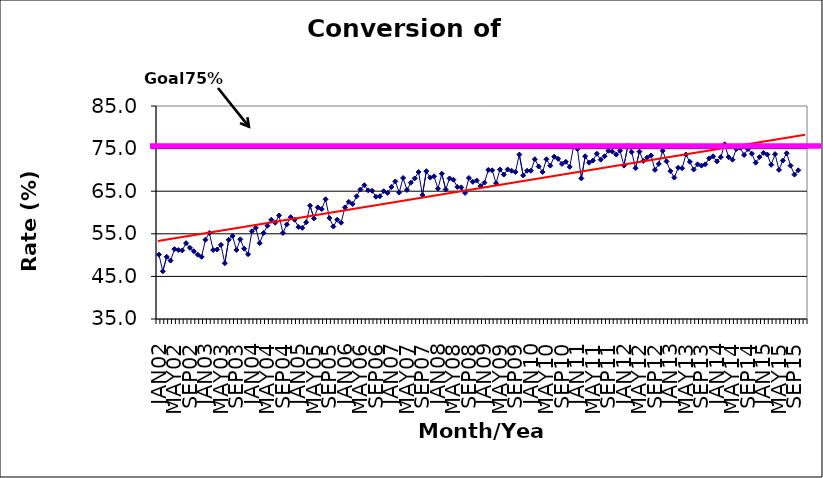
| Category | Series 0 |
|---|---|
| JAN02 | 50.1 |
| FEB02 | 46.2 |
| MAR02 | 49.6 |
| APR02 | 48.7 |
| MAY02 | 51.4 |
| JUN02 | 51.2 |
| JUL02 | 51.1 |
| AUG02 | 52.8 |
| SEP02 | 51.7 |
| OCT02 | 50.9 |
| NOV02 | 50.1 |
| DEC02 | 49.6 |
| JAN03 | 53.6 |
| FEB03 | 55.2 |
| MAR03 | 51.2 |
| APR03 | 51.3 |
| MAY03 | 52.4 |
| JUN03 | 48.1 |
| JUL03 | 53.6 |
| AUG03 | 54.5 |
| SEP03 | 51.2 |
| OCT03 | 53.7 |
| NOV03 | 51.5 |
| DEC03 | 50.2 |
| JAN04 | 55.6 |
| FEB04 | 56.4 |
| MAR04 | 52.8 |
| APR04 | 55.2 |
| MAY04 | 56.9 |
| JUN04 | 58.3 |
| JUL04 | 57.6 |
| AUG04 | 59.3 |
| SEP04 | 55.2 |
| OCT04 | 57.2 |
| NOV04 | 58.9 |
| DEC04 | 58.3 |
| JAN05 | 56.6 |
| FEB05 | 56.4 |
| MAR05 | 57.7 |
| APR05 | 61.6 |
| MAY05 | 58.6 |
| JUN05 | 61.2 |
| JUL05 | 60.8 |
| AUG05 | 63.1 |
| SEP05 | 58.7 |
| OCT05 | 56.7 |
| NOV05 | 58.3 |
| DEC05 | 57.6 |
| JAN06 | 61.2 |
| FEB06 | 62.5 |
| MAR06 | 62 |
| APR06 | 63.8 |
| MAY06 | 65.4 |
| JUN06 | 66.4 |
| JUL06 | 65.2 |
| AUG06 | 65.1 |
| SEP06 | 63.7 |
| OCT06 | 63.8 |
| NOV06 | 65 |
| DEC06 | 64.6 |
| JAN07 | 66 |
| FEB07 | 67.3 |
| MAR07 | 64.7 |
| APR07 | 68.1 |
| MAY07 | 65.3 |
| JUN07 | 67 |
| JUL07 | 68 |
| AUG07 | 69.5 |
| SEP07 | 64.1 |
| OCT07 | 69.7 |
| NOV07 | 68.2 |
| DEC07 | 68.5 |
| JAN08 | 65.6 |
| FEB08 | 69.1 |
| MAR08 | 65.4 |
| APR08 | 68 |
| MAY08 | 67.7 |
| JUN08 | 66 |
| JUL08 | 65.9 |
| AUG08 | 64.6 |
| SEP08 | 68.1 |
| OCT08 | 67.2 |
| NOV08 | 67.5 |
| DEC08 | 66.2 |
| JAN09 | 67 |
| FEB09 | 70 |
| MAR09 | 69.9 |
| APR09 | 66.9 |
| MAY09 | 70.1 |
| JUN09 | 68.9 |
| JUL09 | 70.1 |
| AUG09 | 69.8 |
| SEP09 | 69.5 |
| OCT09 | 73.6 |
| NOV09 | 68.7 |
| DEC09 | 69.8 |
| JAN10 | 69.8 |
| FEB10 | 72.5 |
| MAR10 | 70.8 |
| APR10 | 69.5 |
| MAY10 | 72.5 |
| JUN10 | 71 |
| JUL10 | 73.1 |
| AUG10 | 72.6 |
| SEP10 | 71.4 |
| OCT10 | 71.9 |
| NOV10 | 70.7 |
| DEC10 | 75.5 |
| JAN11 | 74.9 |
| FEB11 | 68 |
| MAR11 | 73.2 |
| APR11 | 71.7 |
| MAY11 | 72.2 |
| JUN11 | 73.8 |
| JUL11 | 72.4 |
| AUG11 | 73.2 |
| SEP11 | 74.5 |
| OCT11 | 74.3 |
| NOV11 | 73.6 |
| DEC11 | 74.5 |
| JAN12 | 71 |
| FEB12 | 75.6 |
| MAR12 | 74.2 |
| APR12 | 70.4 |
| MAY12 | 74.3 |
| JUN12 | 72.1 |
| JUL12 | 72.9 |
| AUG12 | 73.4 |
| SEP12 | 70 |
| OCT12 | 71.4 |
| NOV12 | 74.5 |
| DEC12 | 72 |
| JAN13 | 69.7 |
| FEB13 | 68.2 |
| MAR13 | 70.5 |
| APR13 | 70.4 |
| MAY13 | 73.6 |
| JUN13 | 71.9 |
| JUL13 | 70.1 |
| AUG13 | 71.3 |
| SEP13 | 71 |
| OCT13 | 71.3 |
| NOV13 | 72.7 |
| DEC13 | 73.2 |
| JAN14 | 72 |
| FEB14 | 73 |
| MAR14 | 76 |
| APR14 | 73 |
| MAY14 | 72.4 |
| JUN14 | 74.9 |
| JUL14 | 75.2 |
| AUG14 | 73.5 |
| SEP14 | 74.9 |
| OCT14 | 73.8 |
| NOV14 | 71.7 |
| DEC14 | 73 |
| JAN15 | 74 |
| FEB15 | 73.6 |
| MAR15 | 71.2 |
| APR15 | 73.7 |
| MAY15 | 70 |
| JUN15 | 72.2 |
| JUL15 | 73.9 |
| AUG15 | 71 |
| SEP15 | 68.9 |
| OCT15 | 69.9 |